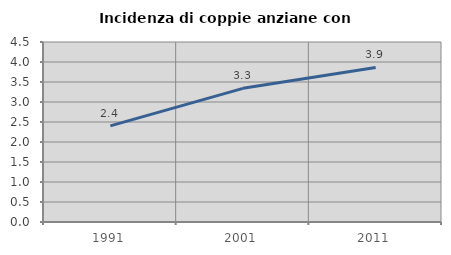
| Category | Incidenza di coppie anziane con figli |
|---|---|
| 1991.0 | 2.404 |
| 2001.0 | 3.342 |
| 2011.0 | 3.864 |